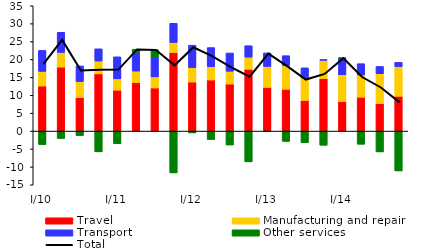
| Category | Travel | Manufacturing and repair | Transport  | Other services |
|---|---|---|---|---|
| I/10 | 12.584 | 4.096 | 5.865 | -3.762 |
| II | 17.873 | 4.096 | 5.628 | -2.057 |
| III | 9.331 | 4.524 | 4.354 | -1.24 |
| IV | 15.976 | 3.588 | 3.42 | -5.801 |
| I/11 | 11.431 | 3.156 | 6.162 | -3.509 |
| II | 13.528 | 3.236 | 5.236 | 0.875 |
| III | 12.037 | 3.104 | 5.449 | 2.149 |
| IV | 21.941 | 2.823 | 5.35 | -11.684 |
| I/12 | 13.692 | 4.048 | 6.252 | -0.513 |
| II | 14.269 | 3.724 | 5.341 | -2.361 |
| III | 13.14 | 3.585 | 5.083 | -3.885 |
| IV | 17.276 | 3.385 | 3.188 | -8.597 |
| I/13 | 12.195 | 5.852 | 3.788 | -0.133 |
| II | 11.675 | 6.652 | 2.738 | -2.878 |
| III | 8.529 | 6.323 | 2.82 | -3.214 |
| IV | 14.674 | 5.118 | 0.175 | -3.954 |
| I/14 | 8.232 | 7.495 | 4.681 | 0.01 |
| II | 9.456 | 6.213 | 3.163 | -3.68 |
| III | 7.658 | 8.378 | 2.02 | -5.821 |
| IV | 9.714 | 8.296 | 1.19 | -11.128 |